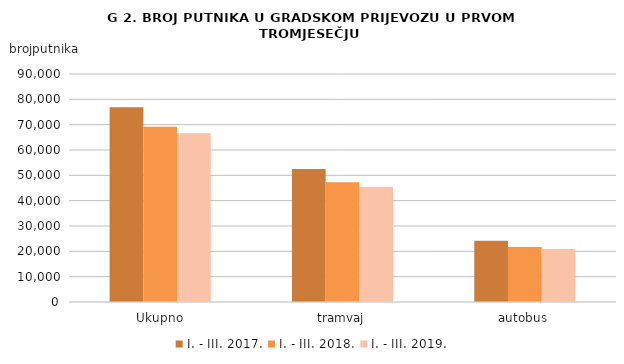
| Category | I. - III. 2017. | I. - III. 2018. | I. - III. 2019. |
|---|---|---|---|
| Ukupno | 76827 | 69215 | 66612 |
| tramvaj | 52502 | 47302 | 45518 |
| autobus | 24152 | 21752 | 20933 |